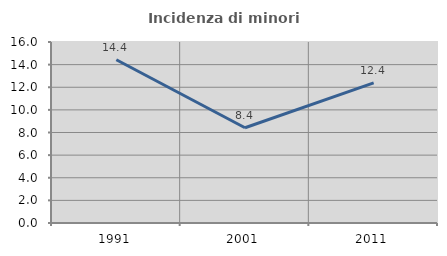
| Category | Incidenza di minori stranieri |
|---|---|
| 1991.0 | 14.433 |
| 2001.0 | 8.421 |
| 2011.0 | 12.381 |